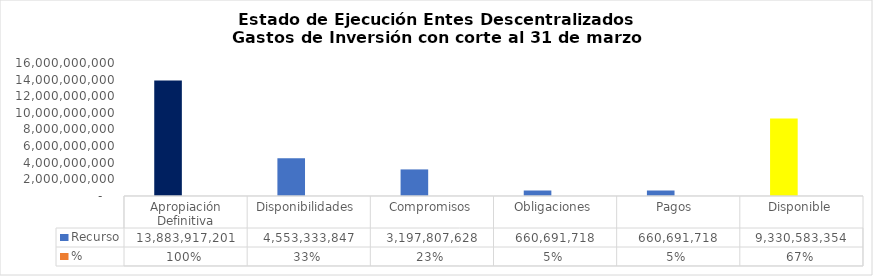
| Category | Recurso  | % |
|---|---|---|
| Apropiación Definitiva | 13883917200.62 | 1 |
| Disponibilidades  | 4553333846.75 | 0.328 |
| Compromisos | 3197807628 | 0.23 |
| Obligaciones | 660691718 | 0.048 |
| Pagos  | 660691718 | 0.048 |
| Disponible | 9330583353.87 | 0.672 |